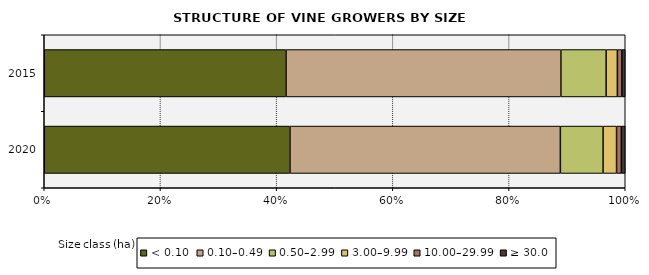
| Category | < 0.10 | 0.10–0.49 | 0.50–2.99 | 3.00–9.99 | 10.00–29.99 | ≥ 30.0 |
|---|---|---|---|---|---|---|
| 2020.0 | 6996 | 7698 | 1215 | 385 | 136 | 111 |
| 2015.0 | 7581 | 8617 | 1418 | 353 | 140 | 107 |